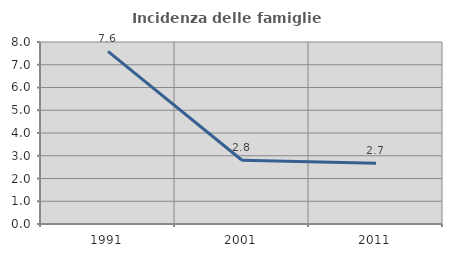
| Category | Incidenza delle famiglie numerose |
|---|---|
| 1991.0 | 7.59 |
| 2001.0 | 2.801 |
| 2011.0 | 2.665 |